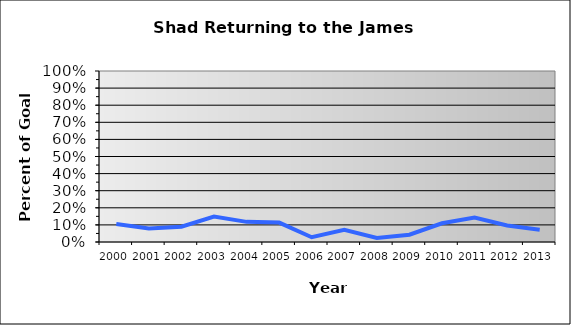
| Category | James Percent Achieved |
|---|---|
| 2000.0 | 0.105 |
| 2001.0 | 0.08 |
| 2002.0 | 0.09 |
| 2003.0 | 0.149 |
| 2004.0 | 0.118 |
| 2005.0 | 0.114 |
| 2006.0 | 0.028 |
| 2007.0 | 0.071 |
| 2008.0 | 0.024 |
| 2009.0 | 0.043 |
| 2010.0 | 0.11 |
| 2011.0 | 0.143 |
| 2012.0 | 0.096 |
| 2013.0 | 0.071 |